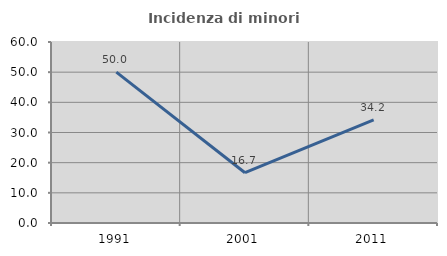
| Category | Incidenza di minori stranieri |
|---|---|
| 1991.0 | 50 |
| 2001.0 | 16.667 |
| 2011.0 | 34.211 |